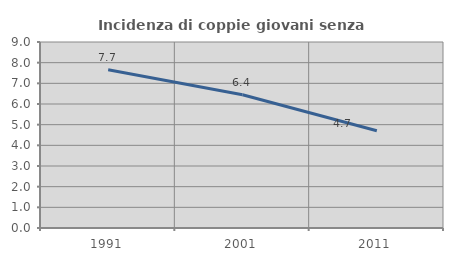
| Category | Incidenza di coppie giovani senza figli |
|---|---|
| 1991.0 | 7.654 |
| 2001.0 | 6.444 |
| 2011.0 | 4.702 |